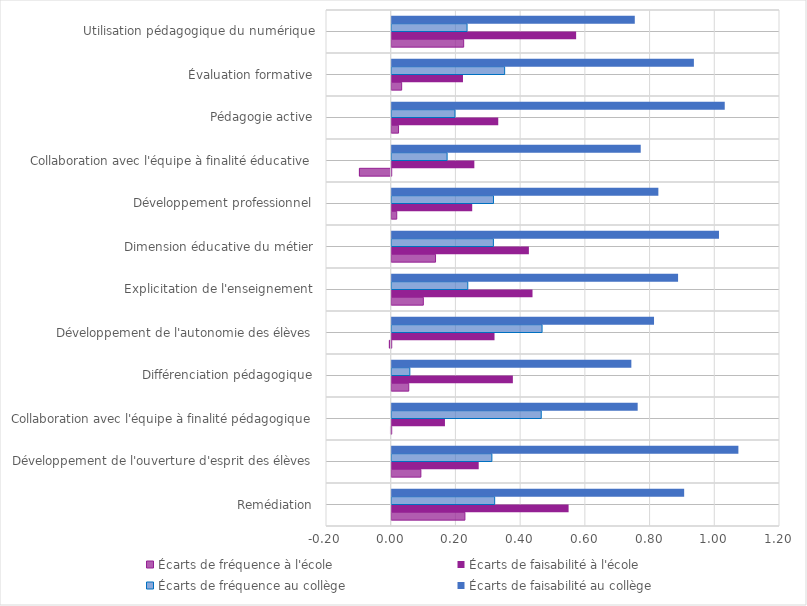
| Category | Écarts de fréquence à l'école | Écarts de faisabilité à l'école | Écarts de fréquence au collège | Écarts de faisabilité au collège |
|---|---|---|---|---|
| Remédiation | 0.226 | 0.547 | 0.318 | 0.904 |
| Développement de l'ouverture d'esprit des élèves | 0.09 | 0.269 | 0.31 | 1.071 |
| Collaboration avec l'équipe à finalité pédagogique | -0.002 | 0.165 | 0.462 | 0.76 |
| Différenciation pédagogique | 0.053 | 0.374 | 0.056 | 0.741 |
| Développement de l'autonomie des élèves | -0.006 | 0.318 | 0.465 | 0.811 |
| Explicitation de l'enseignement | 0.098 | 0.435 | 0.235 | 0.885 |
| Dimension éducative du métier | 0.135 | 0.424 | 0.314 | 1.011 |
| Développement professionnel | 0.016 | 0.249 | 0.315 | 0.824 |
| Collaboration avec l'équipe à finalité éducative | -0.098 | 0.255 | 0.171 | 0.77 |
| Pédagogie active | 0.021 | 0.329 | 0.195 | 1.029 |
| Évaluation formative | 0.031 | 0.22 | 0.349 | 0.934 |
| Utilisation pédagogique du numérique | 0.222 | 0.57 | 0.233 | 0.751 |